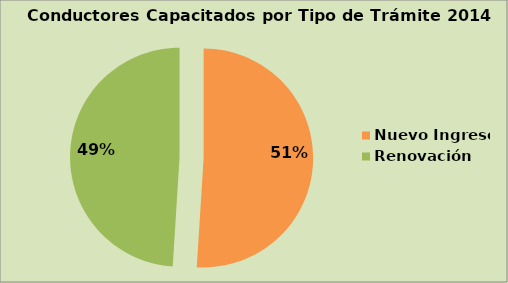
| Category | Series 0 |
|---|---|
| Nuevo Ingreso | 50.998 |
| Renovación | 49.002 |